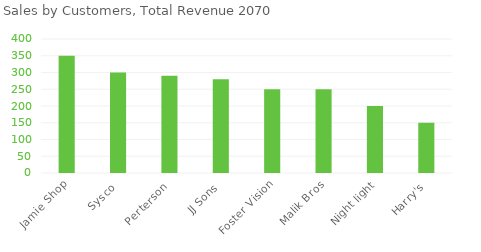
| Category | Series 0 |
|---|---|
| Jamie Shop | 350 |
| Sysco | 300 |
| Perterson | 290 |
| JJ Sons | 280 |
| Foster Vision | 250 |
| Malik Bros | 250 |
| Night light | 200 |
| Harry's | 150 |